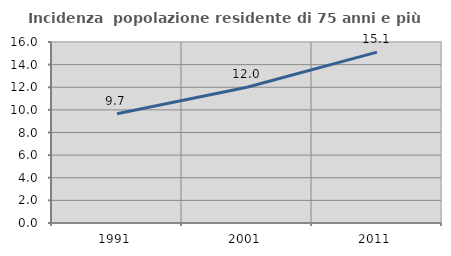
| Category | Incidenza  popolazione residente di 75 anni e più |
|---|---|
| 1991.0 | 9.655 |
| 2001.0 | 11.998 |
| 2011.0 | 15.108 |